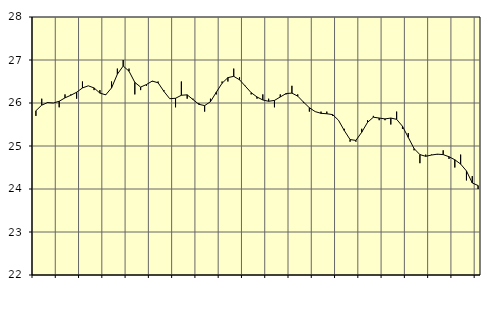
| Category | Piggar | Series 1 |
|---|---|---|
| nan | 25.7 | 25.82 |
| 1.0 | 26.1 | 25.95 |
| 1.0 | 26 | 26.01 |
| 1.0 | 26 | 26 |
| nan | 25.9 | 26.04 |
| 2.0 | 26.2 | 26.12 |
| 2.0 | 26.2 | 26.18 |
| 2.0 | 26.1 | 26.25 |
| nan | 26.5 | 26.35 |
| 3.0 | 26.4 | 26.4 |
| 3.0 | 26.3 | 26.35 |
| 3.0 | 26.3 | 26.23 |
| nan | 26.2 | 26.19 |
| 4.0 | 26.5 | 26.35 |
| 4.0 | 26.8 | 26.67 |
| 4.0 | 27 | 26.86 |
| nan | 26.8 | 26.74 |
| 5.0 | 26.2 | 26.48 |
| 5.0 | 26.3 | 26.37 |
| 5.0 | 26.4 | 26.43 |
| nan | 26.5 | 26.51 |
| 6.0 | 26.5 | 26.47 |
| 6.0 | 26.3 | 26.27 |
| 6.0 | 26.1 | 26.1 |
| nan | 25.9 | 26.11 |
| 7.0 | 26.5 | 26.18 |
| 7.0 | 26.1 | 26.19 |
| 7.0 | 26.1 | 26.08 |
| nan | 26 | 25.97 |
| 8.0 | 25.8 | 25.94 |
| 8.0 | 26.1 | 26.03 |
| 8.0 | 26.2 | 26.25 |
| nan | 26.5 | 26.46 |
| 9.0 | 26.5 | 26.59 |
| 9.0 | 26.8 | 26.62 |
| 9.0 | 26.6 | 26.54 |
| nan | 26.4 | 26.39 |
| 10.0 | 26.2 | 26.24 |
| 10.0 | 26.1 | 26.14 |
| 10.0 | 26.2 | 26.07 |
| nan | 26.1 | 26.04 |
| 11.0 | 25.9 | 26.06 |
| 11.0 | 26.2 | 26.14 |
| 11.0 | 26.2 | 26.22 |
| nan | 26.4 | 26.23 |
| 12.0 | 26.2 | 26.16 |
| 12.0 | 26 | 26.02 |
| 12.0 | 25.8 | 25.89 |
| nan | 25.8 | 25.8 |
| 13.0 | 25.8 | 25.76 |
| 13.0 | 25.8 | 25.75 |
| 13.0 | 25.7 | 25.73 |
| nan | 25.6 | 25.6 |
| 14.0 | 25.4 | 25.36 |
| 14.0 | 25.1 | 25.15 |
| 14.0 | 25.1 | 25.13 |
| nan | 25.4 | 25.32 |
| 15.0 | 25.6 | 25.55 |
| 15.0 | 25.7 | 25.67 |
| 15.0 | 25.6 | 25.65 |
| nan | 25.6 | 25.63 |
| 16.0 | 25.5 | 25.65 |
| 16.0 | 25.8 | 25.62 |
| 16.0 | 25.4 | 25.46 |
| nan | 25.3 | 25.2 |
| 17.0 | 24.9 | 24.94 |
| 17.0 | 24.6 | 24.8 |
| 17.0 | 24.8 | 24.76 |
| nan | 24.8 | 24.79 |
| 18.0 | 24.8 | 24.81 |
| 18.0 | 24.9 | 24.8 |
| 18.0 | 24.7 | 24.75 |
| nan | 24.5 | 24.68 |
| 19.0 | 24.8 | 24.58 |
| 19.0 | 24.2 | 24.42 |
| 19.0 | 24.3 | 24.14 |
| nan | 24 | 24.08 |